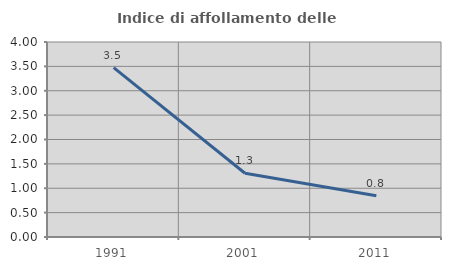
| Category | Indice di affollamento delle abitazioni  |
|---|---|
| 1991.0 | 3.474 |
| 2001.0 | 1.308 |
| 2011.0 | 0.844 |